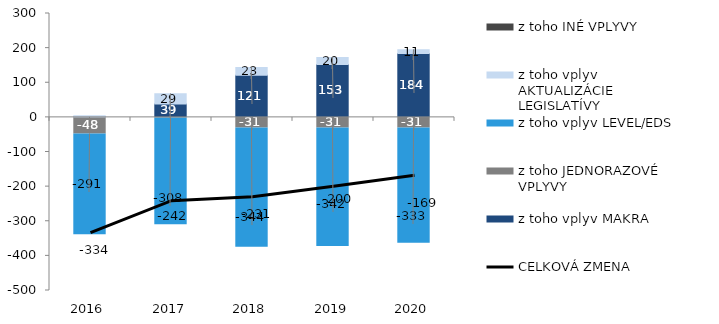
| Category | z toho vplyv MAKRA | z toho JEDNORAZOVÉ VPLYVY | z toho vplyv LEVEL/EDS | z toho vplyv AKTUALIZÁCIE LEGISLATÍVY | z toho INÉ VPLYVY |
|---|---|---|---|---|---|
| 2016.0 | 1.339 | -47.999 | -291.233 | 3.508 | 0 |
| 2017.0 | 38.901 | -1.507 | -308.434 | 28.993 | 0 |
| 2018.0 | 121.427 | -30.587 | -344.143 | 22.542 | 0 |
| 2019.0 | 152.685 | -30.587 | -342.481 | 19.97 | 0 |
| 2020.0 | 184.169 | -30.587 | -333.196 | 11.076 | 0 |